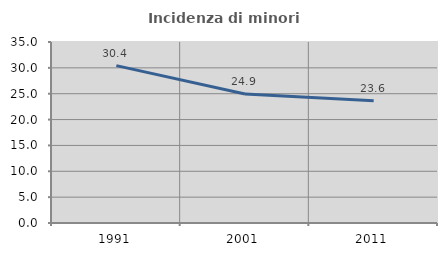
| Category | Incidenza di minori stranieri |
|---|---|
| 1991.0 | 30.435 |
| 2001.0 | 24.938 |
| 2011.0 | 23.647 |